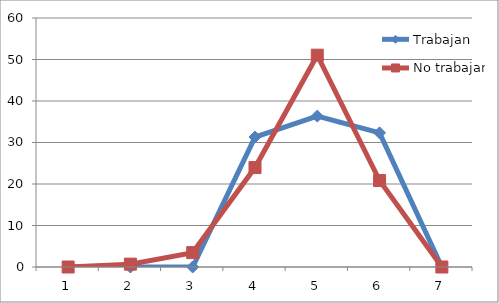
| Category | Trabajan | No trabajan |
|---|---|---|
| 0 | 0 | 0 |
| 1 | 0 | 0.69 |
| 2 | 0 | 3.47 |
| 3 | 31.31 | 23.96 |
| 4 | 36.36 | 51.04 |
| 5 | 32.32 | 20.83 |
| 6 | 0 | 0 |